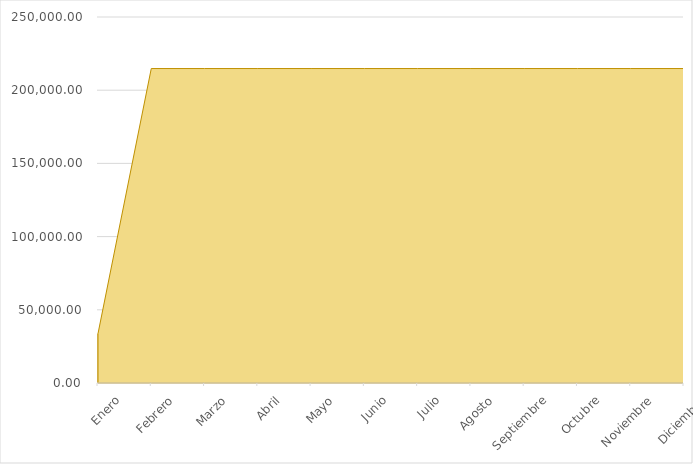
| Category | Series 0 |
|---|---|
| Enero | 33750 |
| Febrero | 214800 |
| Marzo | 214800 |
| Abril | 214800 |
| Mayo | 214800 |
| Junio | 214800 |
| Julio | 214800 |
| Agosto | 214800 |
| Septiembre | 214800 |
| Octubre | 214800 |
| Noviembre | 214800 |
| Diciembre | 214800 |